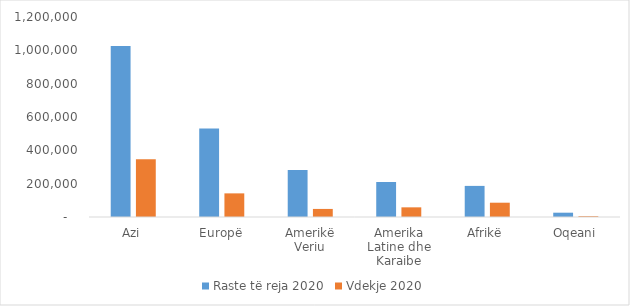
| Category |  Raste të reja 2020  |  Vdekje 2020  |
|---|---|---|
| Azi | 1026171 | 346009 |
| Europë | 531086 | 141765 |
| Amerikë Veriu | 281591 | 48407 |
| Amerika Latine dhe Karaibe | 210100 | 57984 |
| Afrikë | 186598 | 85787 |
| Oqeani | 25873 | 5044 |